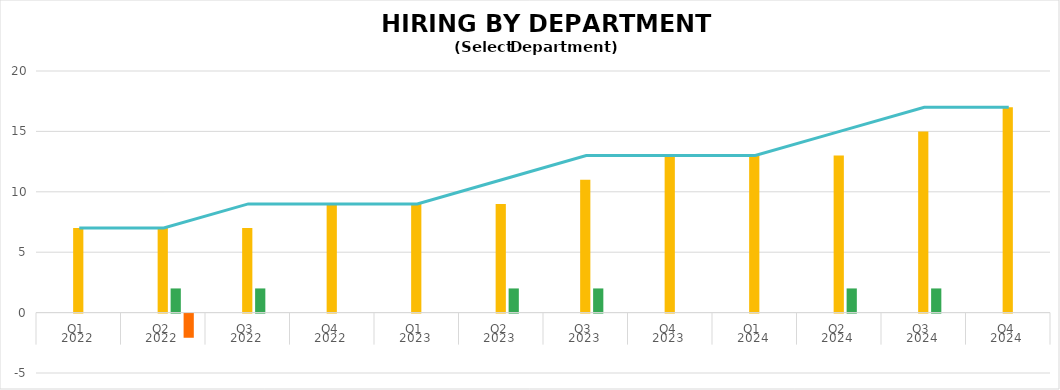
| Category | Series 0 | Series 1 | Series 2 | Series 3 | Series 4 |
|---|---|---|---|---|---|
| 0 |  |  | 7 | 0 | 0 |
| 1 |  |  | 7 | 2 | -2 |
| 2 |  |  | 7 | 2 | 0 |
| 3 |  |  | 9 | 0 | 0 |
| 4 |  |  | 9 | 0 | 0 |
| 5 |  |  | 9 | 2 | 0 |
| 6 |  |  | 11 | 2 | 0 |
| 7 |  |  | 13 | 0 | 0 |
| 8 |  |  | 13 | 0 | 0 |
| 9 |  |  | 13 | 2 | 0 |
| 10 |  |  | 15 | 2 | 0 |
| 11 |  |  | 17 | 0 | 0 |